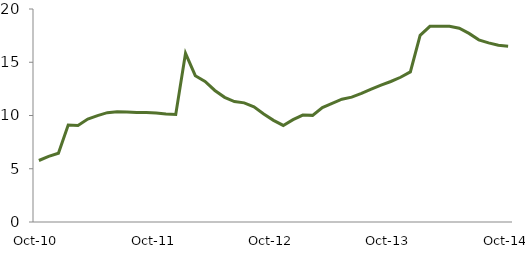
| Category | Series 0 |
|---|---|
| Oct-10 | 5.775 |
|  | 6.16 |
|  | 6.454 |
|  | 9.112 |
|  | 9.055 |
|  | 9.664 |
|  | 9.991 |
|  | 10.267 |
|  | 10.363 |
|  | 10.338 |
|  | 10.273 |
|  | 10.288 |
| Oct-11 | 10.237 |
|  | 10.151 |
|  | 10.1 |
|  | 15.839 |
|  | 13.738 |
|  | 13.199 |
|  | 12.351 |
|  | 11.706 |
|  | 11.314 |
|  | 11.188 |
|  | 10.816 |
|  | 10.141 |
| Oct-12 | 9.544 |
|  | 9.067 |
|  | 9.616 |
|  | 10.045 |
|  | 10.013 |
|  | 10.751 |
|  | 11.131 |
|  | 11.532 |
|  | 11.724 |
|  | 12.082 |
|  | 12.472 |
|  | 12.86 |
| Oct-13 | 13.193 |
|  | 13.59 |
|  | 14.096 |
|  | 17.526 |
|  | 18.377 |
|  | 18.389 |
|  | 18.378 |
|  | 18.197 |
|  | 17.708 |
|  | 17.106 |
|  | 16.821 |
|  | 16.591 |
| Oct-14 | 16.507 |